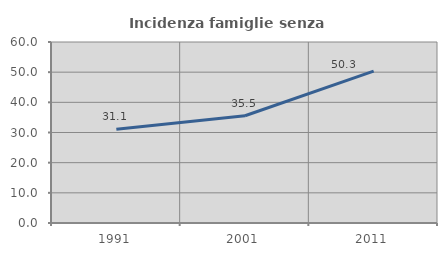
| Category | Incidenza famiglie senza nuclei |
|---|---|
| 1991.0 | 31.066 |
| 2001.0 | 35.545 |
| 2011.0 | 50.327 |